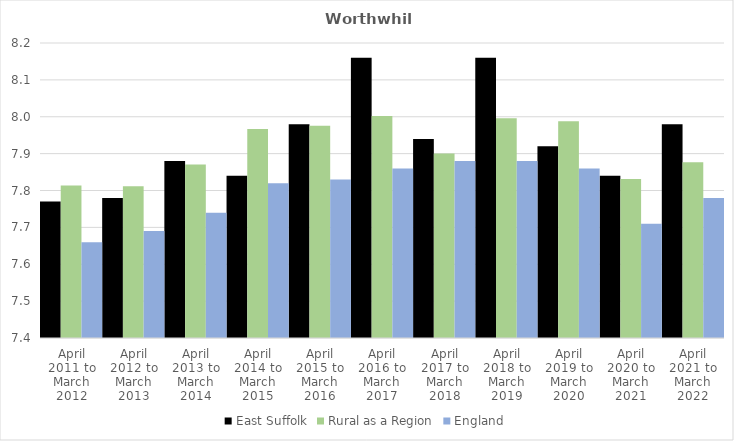
| Category | East Suffolk | Rural as a Region | England |
|---|---|---|---|
| April 2011 to March 2012 | 7.77 | 7.813 | 7.66 |
| April 2012 to March 2013 | 7.78 | 7.811 | 7.69 |
| April 2013 to March 2014 | 7.88 | 7.871 | 7.74 |
| April 2014 to March 2015 | 7.84 | 7.967 | 7.82 |
| April 2015 to March 2016 | 7.98 | 7.975 | 7.83 |
| April 2016 to March 2017 | 8.16 | 8.002 | 7.86 |
| April 2017 to March 2018 | 7.94 | 7.9 | 7.88 |
| April 2018 to March 2019 | 8.16 | 7.996 | 7.88 |
| April 2019 to March 2020 | 7.92 | 7.988 | 7.86 |
| April 2020 to March 2021 | 7.84 | 7.831 | 7.71 |
| April 2021 to March 2022 | 7.98 | 7.877 | 7.78 |